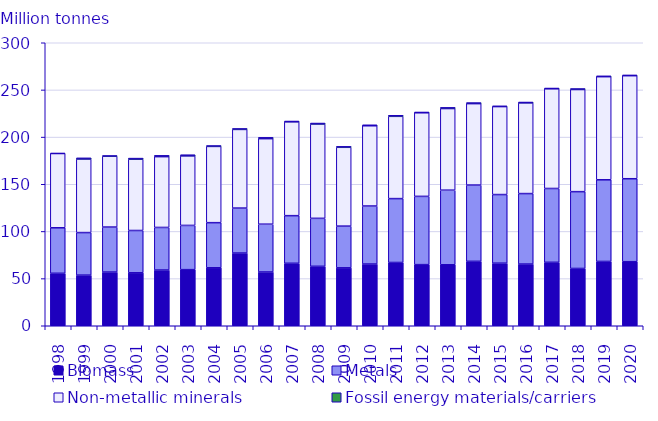
| Category | Biomass | Metals | Non-metallic minerals | Fossil energy materials/carriers |
|---|---|---|---|---|
| 1998.0 | 55.605 | 48.234 | 78.756 | 0.319 |
| 1999.0 | 53.658 | 45.113 | 77.989 | 1.234 |
| 2000.0 | 56.896 | 47.732 | 75.055 | 0.712 |
| 2001.0 | 56.119 | 44.862 | 75.561 | 1.169 |
| 2002.0 | 59.06 | 45.156 | 75.047 | 1.406 |
| 2003.0 | 59.466 | 46.889 | 73.732 | 1.243 |
| 2004.0 | 61.446 | 47.83 | 80.845 | 0.894 |
| 2005.0 | 77.07 | 47.687 | 83.378 | 1 |
| 2006.0 | 56.982 | 50.691 | 90.646 | 1.427 |
| 2007.0 | 66.232 | 50.466 | 99.471 | 0.878 |
| 2008.0 | 63.017 | 50.844 | 99.977 | 1.071 |
| 2009.0 | 61.4 | 44.222 | 83.551 | 1.002 |
| 2010.0 | 65.423 | 61.516 | 85.067 | 1.039 |
| 2011.0 | 67.069 | 67.717 | 87.229 | 1.125 |
| 2012.0 | 64.789 | 72.374 | 88.61 | 0.847 |
| 2013.0 | 64.637 | 79.086 | 86.528 | 1.255 |
| 2014.0 | 68.304 | 80.836 | 86.326 | 1.112 |
| 2015.0 | 66.336 | 72.734 | 93.26 | 0.718 |
| 2016.0 | 65.388 | 74.733 | 96.14 | 0.925 |
| 2017.0 | 67.26 | 78.264 | 105.678 | 0.825 |
| 2018.0 | 60.729 | 81.424 | 108.271 | 1.04 |
| 2019.0 | 68.173 | 86.554 | 109.302 | 0.863 |
| 2020.0 | 67.909 | 87.949 | 109.225 | 0.787 |